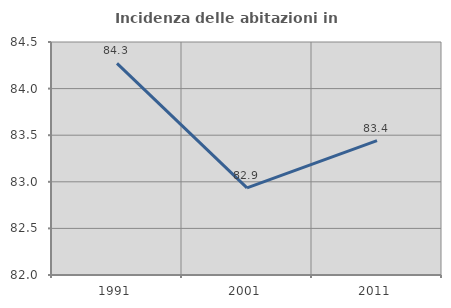
| Category | Incidenza delle abitazioni in proprietà  |
|---|---|
| 1991.0 | 84.272 |
| 2001.0 | 82.935 |
| 2011.0 | 83.442 |